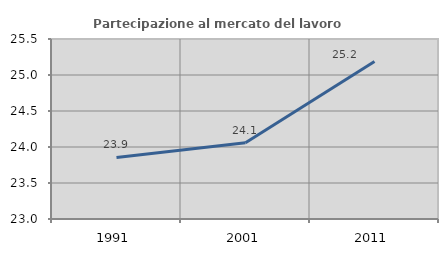
| Category | Partecipazione al mercato del lavoro  femminile |
|---|---|
| 1991.0 | 23.855 |
| 2001.0 | 24.059 |
| 2011.0 | 25.187 |